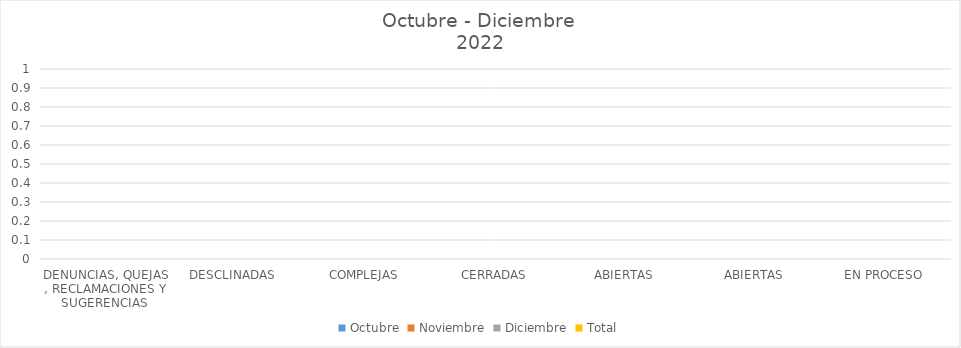
| Category | Octubre | Noviembre | Diciembre | Total |
|---|---|---|---|---|
| DENUNCIAS, QUEJAS , RECLAMACIONES Y SUGERENCIAS  | 0 | 0 | 0 | 0 |
| DESCLINADAS  | 0 | 0 | 0 | 0 |
| COMPLEJAS | 0 | 0 | 0 | 0 |
| CERRADAS | 0 | 0 | 0 | 0 |
| ABIERTAS | 0 | 0 | 0 | 0 |
| ABIERTAS | 0 | 0 | 0 | 0 |
| EN PROCESO | 0 | 0 | 0 | 0 |